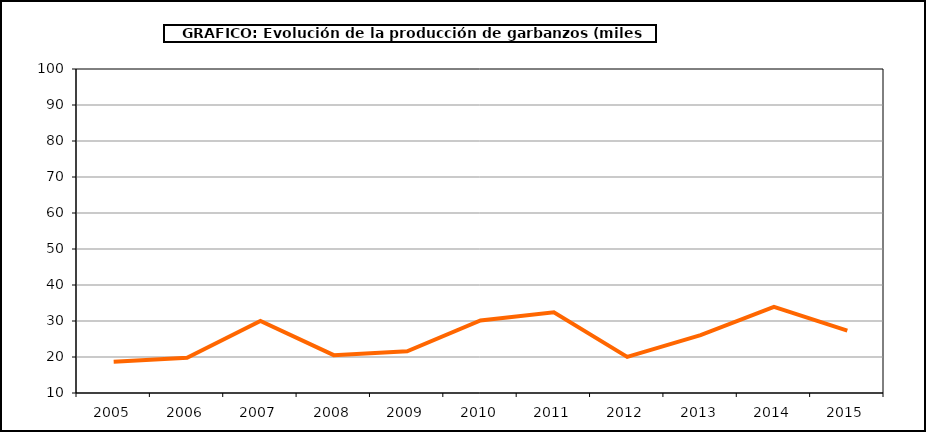
| Category | Superficie |
|---|---|
| 2005.0 | 18.7 |
| 2006.0 | 19.764 |
| 2007.0 | 30.029 |
| 2008.0 | 20.515 |
| 2009.0 | 21.568 |
| 2010.0 | 30.143 |
| 2011.0 | 32.408 |
| 2012.0 | 20.03 |
| 2013.0 | 26.073 |
| 2014.0 | 33.954 |
| 2015.0 | 27.348 |